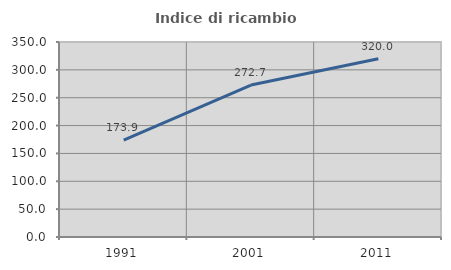
| Category | Indice di ricambio occupazionale  |
|---|---|
| 1991.0 | 173.913 |
| 2001.0 | 272.727 |
| 2011.0 | 320 |